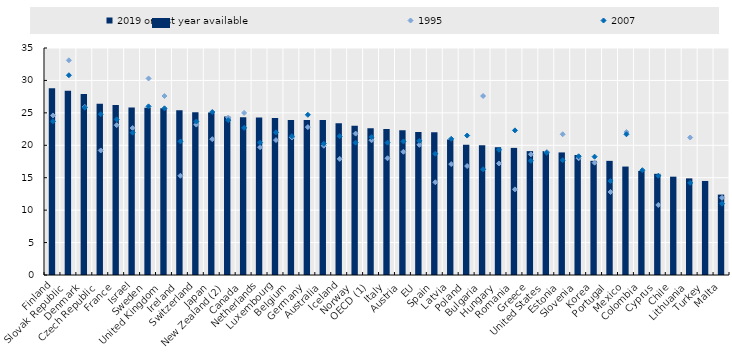
| Category | 2019 or last year available |
|---|---|
| Finland | 28.8 |
| Slovak Republic | 28.4 |
| Denmark | 27.9 |
| Czech Republic | 26.4 |
| France | 26.2 |
| Israel | 25.845 |
| Sweden | 25.8 |
| United Kingdom | 25.7 |
| Ireland | 25.4 |
| Switzerland | 25.105 |
| Japan | 25.055 |
| New Zealand (2) | 24.446 |
| Canada | 24.321 |
| Netherlands | 24.3 |
| Luxembourg | 24.2 |
| Belgium | 23.9 |
| Germany | 23.9 |
| Australia | 23.897 |
| Iceland | 23.4 |
| Norway | 23 |
| OECD (1) | 22.622 |
| Italy | 22.5 |
| Austria | 22.3 |
| EU | 22.037 |
| Spain | 22 |
| Latvia | 20.9 |
| Poland | 20.1 |
| Bulgaria | 20 |
| Hungary | 19.7 |
| Romania | 19.6 |
| Greece | 19.1 |
| United States | 19.1 |
| Estonia | 18.9 |
| Slovenia | 18.5 |
| Korea | 17.602 |
| Portugal | 17.6 |
| Mexico | 16.721 |
| Colombia | 16.047 |
| Cyprus | 15.6 |
| Chile | 15.159 |
| Lithuania | 14.9 |
| Turkey | 14.5 |
| Malta | 12.4 |